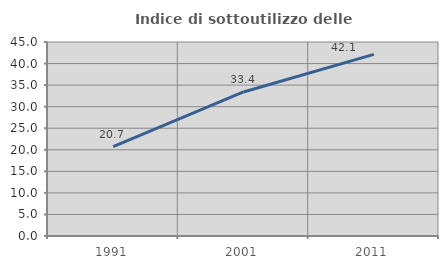
| Category | Indice di sottoutilizzo delle abitazioni  |
|---|---|
| 1991.0 | 20.719 |
| 2001.0 | 33.41 |
| 2011.0 | 42.117 |